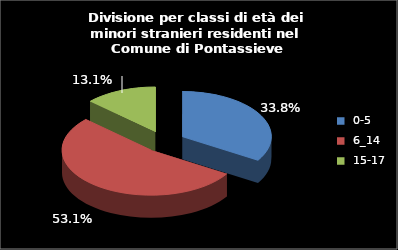
| Category | Series 0 |
|---|---|
| 0-5 | 142 |
| 6_14 | 223 |
| 15-17 | 55 |